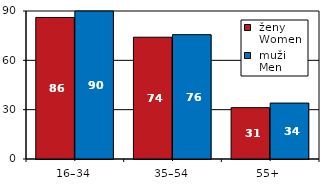
| Category |  ženy 
 Women |  muži 
 Men |
|---|---|---|
| 16–34 | 86.069 | 90.164 |
| 35–54 | 74.049 | 75.611 |
| 55+  | 31.224 | 34.013 |